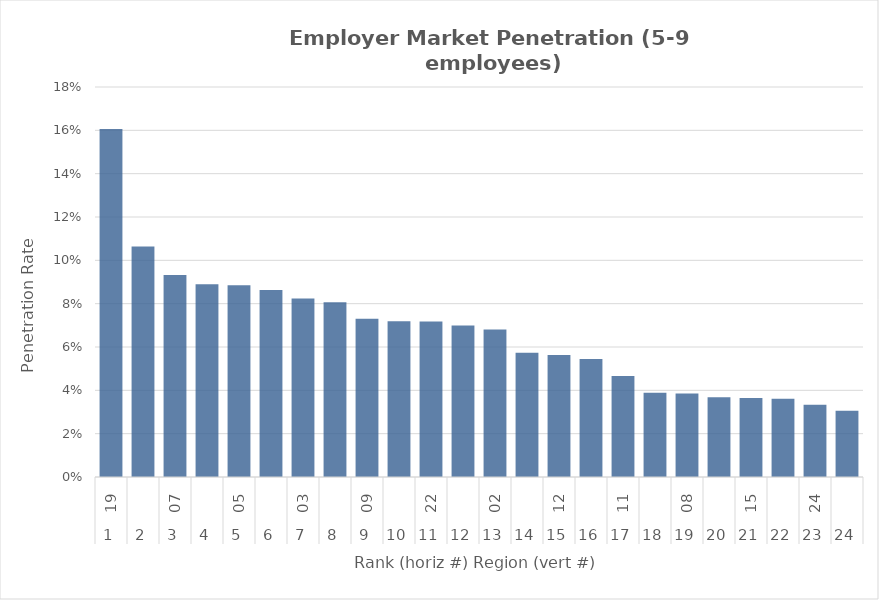
| Category | Rate |
|---|---|
| 0 | 0.161 |
| 1 | 0.106 |
| 2 | 0.093 |
| 3 | 0.089 |
| 4 | 0.088 |
| 5 | 0.086 |
| 6 | 0.082 |
| 7 | 0.081 |
| 8 | 0.073 |
| 9 | 0.072 |
| 10 | 0.072 |
| 11 | 0.07 |
| 12 | 0.068 |
| 13 | 0.057 |
| 14 | 0.056 |
| 15 | 0.054 |
| 16 | 0.047 |
| 17 | 0.039 |
| 18 | 0.039 |
| 19 | 0.037 |
| 20 | 0.037 |
| 21 | 0.036 |
| 22 | 0.033 |
| 23 | 0.031 |